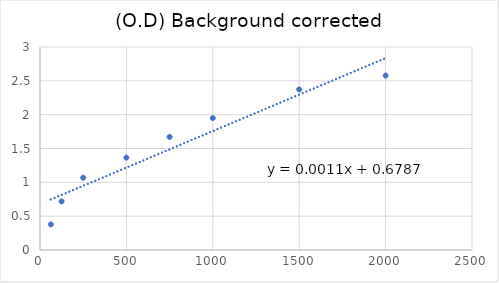
| Category | (O.D) Background corrected |
|---|---|
| 62.5 | 0.378 |
| 125.0 | 0.719 |
| 250.0 | 1.068 |
| 500.0 | 1.365 |
| 750.0 | 1.672 |
| 1000.0 | 1.95 |
| 1500.0 | 2.373 |
| 2000.0 | 2.578 |